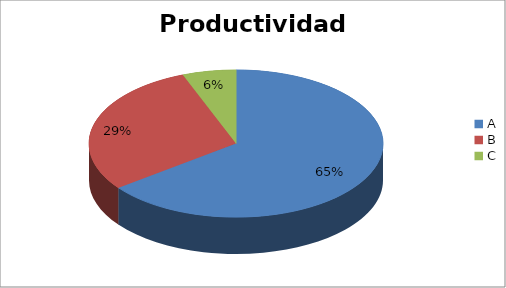
| Category | Series 0 |
|---|---|
| A | 64.706 |
| B | 29.412 |
| C | 5.882 |